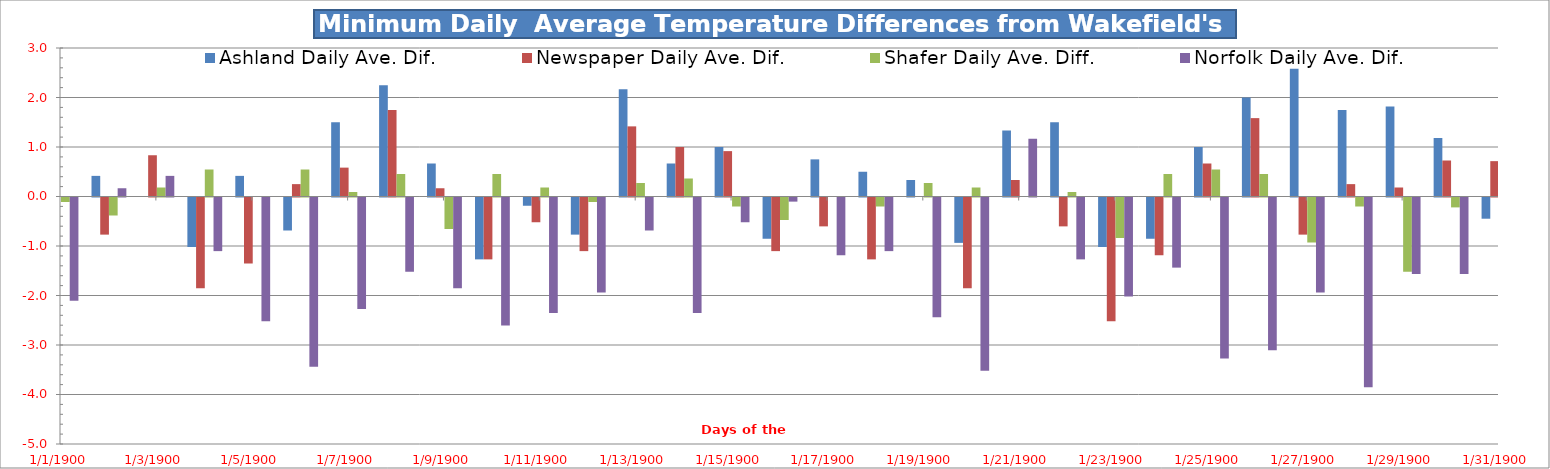
| Category | Ashland Daily Ave. Dif. | Newspaper Daily Ave. Dif. | Shafer Daily Ave. Diff. | Norfolk Daily Ave. Dif. |
|---|---|---|---|---|
| 0 | -1 | -1.167 | -0.091 | -2.083 |
| 1 | 0.417 | -0.75 | -0.364 | 0.167 |
| 2 | 0 | 0.833 | 0.182 | 0.417 |
| 3 | -1 | -1.833 | 0.545 | -1.083 |
| 4 | 0.417 | -1.333 | 0 | -2.5 |
| 5 | -0.667 | 0.25 | 0.545 | -3.417 |
| 6 | 1.5 | 0.583 | 0.091 | -2.25 |
| 7 | 2.25 | 1.75 | 0.455 | -1.5 |
| 8 | 0.667 | 0.167 | -0.636 | -1.833 |
| 9 | -1.25 | -1.25 | 0.455 | -2.583 |
| 10 | -0.167 | -0.5 | 0.182 | -2.333 |
| 11 | -0.75 | -1.083 | -0.091 | -1.917 |
| 12 | 2.167 | 1.417 | 0.273 | -0.667 |
| 13 | 0.667 | 1 | 0.364 | -2.333 |
| 14 | 1 | 0.917 | -0.182 | -0.5 |
| 15 | -0.833 | -1.083 | -0.455 | -0.083 |
| 16 | 0.75 | -0.583 | 0 | -1.167 |
| 17 | 0.5 | -1.25 | -0.182 | -1.083 |
| 18 | 0.333 | 0 | 0.273 | -2.417 |
| 19 | -0.917 | -1.833 | 0.182 | -3.5 |
| 20 | 1.333 | 0.333 | 0 | 1.167 |
| 21 | 1.5 | -0.583 | 0.091 | -1.25 |
| 22 | -1 | -2.5 | -0.818 | -2 |
| 23 | -0.833 | -1.167 | 0.455 | -1.417 |
| 24 | 1 | 0.667 | 0.545 | -3.25 |
| 25 | 2 | 1.583 | 0.455 | -3.083 |
| 26 | 2.583 | -0.75 | -0.909 | -1.917 |
| 27 | 1.75 | 0.25 | -0.182 | -3.833 |
| 28 | 1.818 | 0.182 | -1.5 | -1.545 |
| 29 | 1.182 | 0.727 | -0.2 | -1.545 |
| 30 | -0.429 | 0.714 | -0.857 | 2.429 |